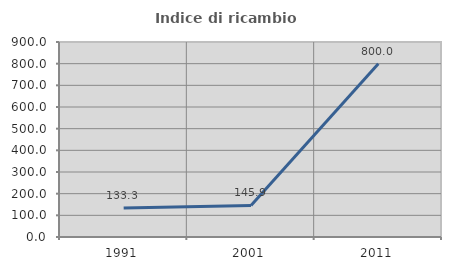
| Category | Indice di ricambio occupazionale  |
|---|---|
| 1991.0 | 133.333 |
| 2001.0 | 145.946 |
| 2011.0 | 800 |